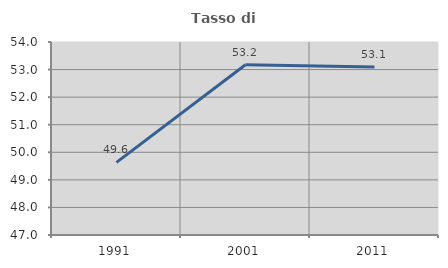
| Category | Tasso di occupazione   |
|---|---|
| 1991.0 | 49.632 |
| 2001.0 | 53.176 |
| 2011.0 | 53.094 |